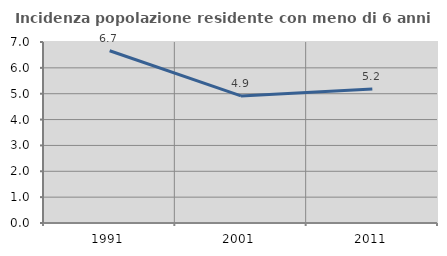
| Category | Incidenza popolazione residente con meno di 6 anni |
|---|---|
| 1991.0 | 6.661 |
| 2001.0 | 4.915 |
| 2011.0 | 5.186 |